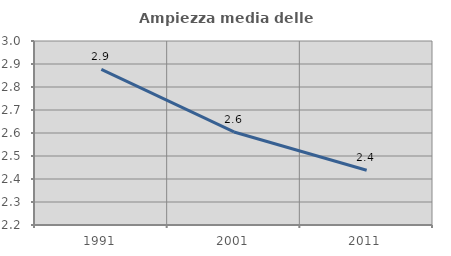
| Category | Ampiezza media delle famiglie |
|---|---|
| 1991.0 | 2.876 |
| 2001.0 | 2.604 |
| 2011.0 | 2.438 |